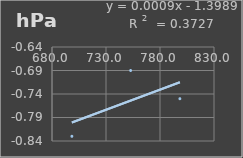
| Category | Presión Admosferica |
|---|---|
| 698.4 | -0.83 |
| 752.8 | -0.69 |
| 798.4 | -0.75 |